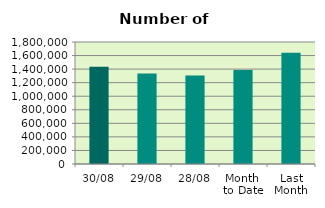
| Category | Series 0 |
|---|---|
| 30/08 | 1435586 |
| 29/08 | 1336236 |
| 28/08 | 1304548 |
| Month 
to Date | 1387587.182 |
| Last
Month | 1640369.455 |